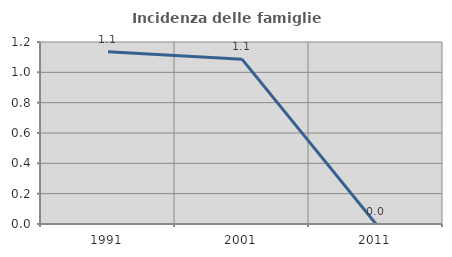
| Category | Incidenza delle famiglie numerose |
|---|---|
| 1991.0 | 1.136 |
| 2001.0 | 1.087 |
| 2011.0 | 0 |